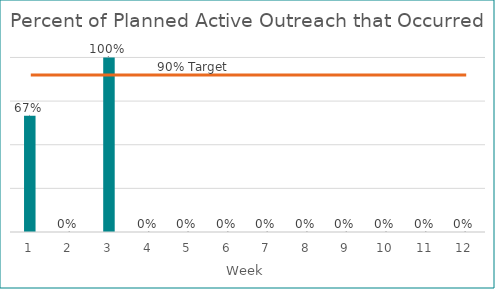
| Category | Planned Outreach that Occurred
% |
|---|---|
| 0 | 0.667 |
| 1 | 0 |
| 2 | 1 |
| 3 | 0 |
| 4 | 0 |
| 5 | 0 |
| 6 | 0 |
| 7 | 0 |
| 8 | 0 |
| 9 | 0 |
| 10 | 0 |
| 11 | 0 |